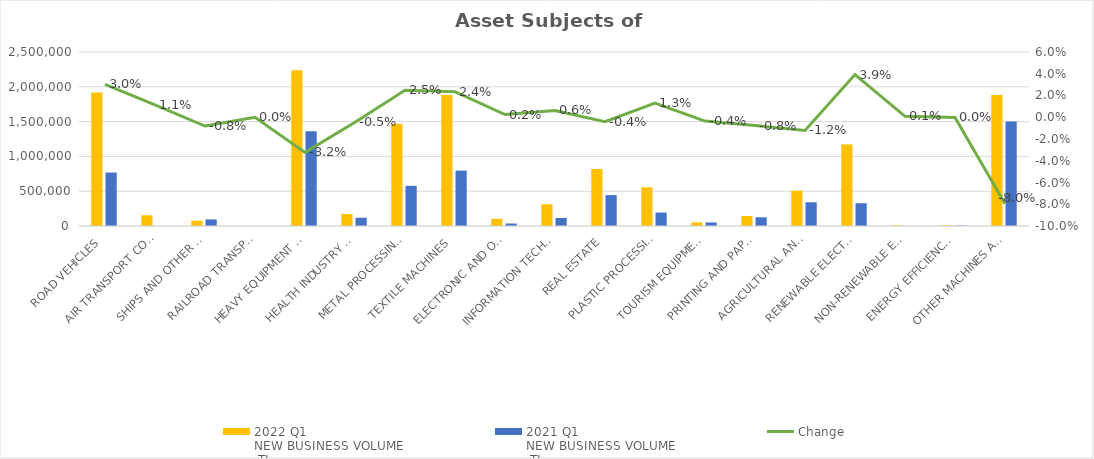
| Category | 2022 Q1 
NEW BUSINESS VOLUME
 TL | 2021 Q1 
NEW BUSINESS VOLUME
 TL |
|---|---|---|
| ROAD VEHICLES | 1919451.275 | 767981.911 |
| AIR TRANSPORT CONVEYANCE | 154435 | 0 |
| SHIPS AND OTHER SEA-GOING VESSELS | 76669 | 94401.142 |
| RAILROAD TRANSPORT VEHICLES | 0 | 0 |
| HEAVY EQUIPMENT AND CONSTRUCTION MACHINERY | 2239554.344 | 1359749.597 |
| HEALTH INDUSTRY AND AESTHETIC INSTRUMENTS | 172860.711 | 119184.164 |
| METAL PROCESSING MACHINE | 1468984.044 | 577018.97 |
| TEXTILE MACHINES | 1883319.779 | 795861.151 |
| ELECTRONIC AND OPTICAL DEVICES | 102963.667 | 35602.411 |
| INFORMATION TECHNOLOGIES AND OFFICE SYSTEMS | 312224.365 | 115852.498 |
| REAL ESTATE | 819868.423 | 444380 |
| PLASTIC PROCESSING MACHINES | 556428.832 | 193063.532 |
| TOURISM EQUIPMENT | 52656.719 | 51005.432 |
| PRINTING AND PAPER PROCESSING MACHINES | 143880.669 | 125323.531 |
| AGRICULTURAL AND LIVESTOCK FARMING MACHINES | 508036.8 | 341134.489 |
| RENEWABLE ELECTRICITY GENERATION | 1171947.614 | 326876.988 |
| NON-RENEWABLE ELECTRIC ENERGY GENERATION | 11337 | 0 |
| ENERGY EFFICIENCY EQUIPMENT | 11273.342 | 6933.265 |
| OTHER MACHINES AND EQUIPMENT | 1882207.155 | 1501874.248 |